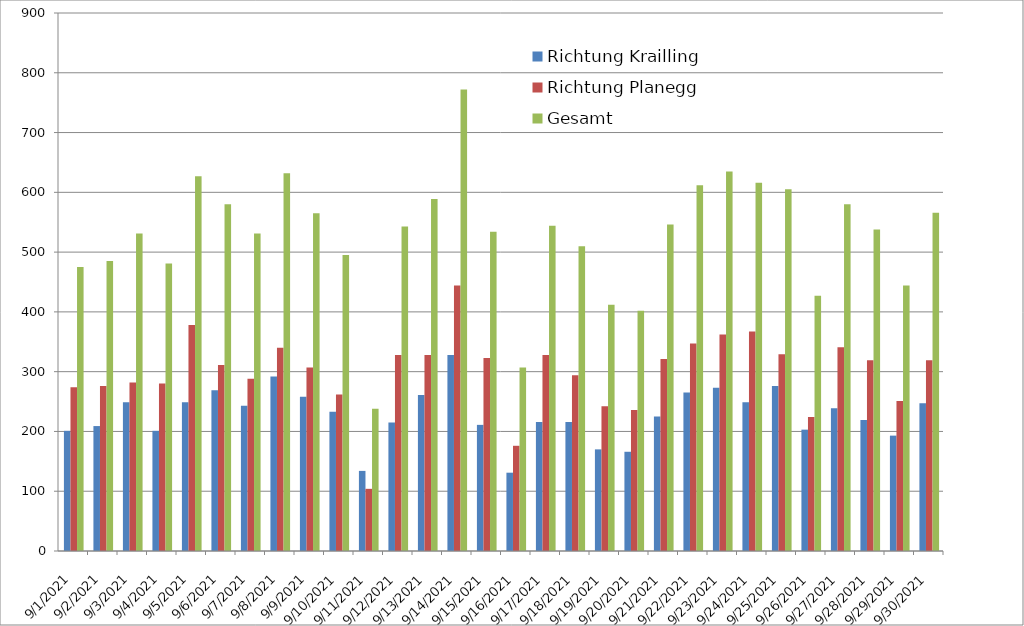
| Category | Richtung Krailling | Richtung Planegg | Gesamt |
|---|---|---|---|
| 9/1/21 | 201 | 274 | 475 |
| 9/2/21 | 209 | 276 | 485 |
| 9/3/21 | 249 | 282 | 531 |
| 9/4/21 | 201 | 280 | 481 |
| 9/5/21 | 249 | 378 | 627 |
| 9/6/21 | 269 | 311 | 580 |
| 9/7/21 | 243 | 288 | 531 |
| 9/8/21 | 292 | 340 | 632 |
| 9/9/21 | 258 | 307 | 565 |
| 9/10/21 | 233 | 262 | 495 |
| 9/11/21 | 134 | 104 | 238 |
| 9/12/21 | 215 | 328 | 543 |
| 9/13/21 | 261 | 328 | 589 |
| 9/14/21 | 328 | 444 | 772 |
| 9/15/21 | 211 | 323 | 534 |
| 9/16/21 | 131 | 176 | 307 |
| 9/17/21 | 216 | 328 | 544 |
| 9/18/21 | 216 | 294 | 510 |
| 9/19/21 | 170 | 242 | 412 |
| 9/20/21 | 166 | 236 | 402 |
| 9/21/21 | 225 | 321 | 546 |
| 9/22/21 | 265 | 347 | 612 |
| 9/23/21 | 273 | 362 | 635 |
| 9/24/21 | 249 | 367 | 616 |
| 9/25/21 | 276 | 329 | 605 |
| 9/26/21 | 203 | 224 | 427 |
| 9/27/21 | 239 | 341 | 580 |
| 9/28/21 | 219 | 319 | 538 |
| 9/29/21 | 193 | 251 | 444 |
| 9/30/21 | 247 | 319 | 566 |